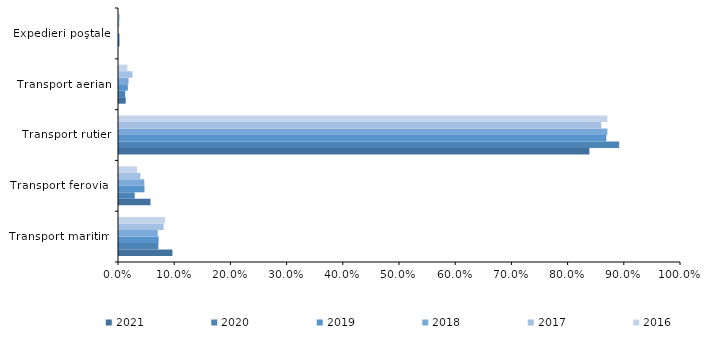
| Category | 2021 | 2020 | 2019 | 2018 | 2017 | 2016 |
|---|---|---|---|---|---|---|
| Transport maritim | 9.5 | 7 | 7.06 | 6.9 | 7.93 | 8.2 |
| Transport feroviar | 5.6 | 2.8 | 4.54 | 4.5 | 3.81 | 3.2 |
| Transport rutier | 83.7 | 89 | 86.71 | 86.9 | 85.8 | 86.9 |
| Transport aerian | 1.2 | 1.1 | 1.57 | 1.7 | 2.39 | 1.5 |
| Expedieri poştale | 0 | 0.1 | 0.11 | 0 | 0.06 | 0.2 |